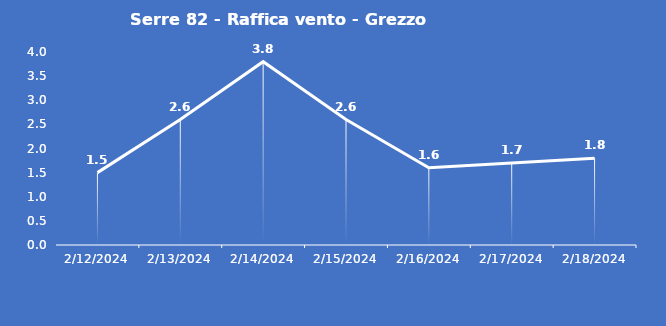
| Category | Serre 82 - Raffica vento - Grezzo (m/s) |
|---|---|
| 2/12/24 | 1.5 |
| 2/13/24 | 2.6 |
| 2/14/24 | 3.8 |
| 2/15/24 | 2.6 |
| 2/16/24 | 1.6 |
| 2/17/24 | 1.7 |
| 2/18/24 | 1.8 |